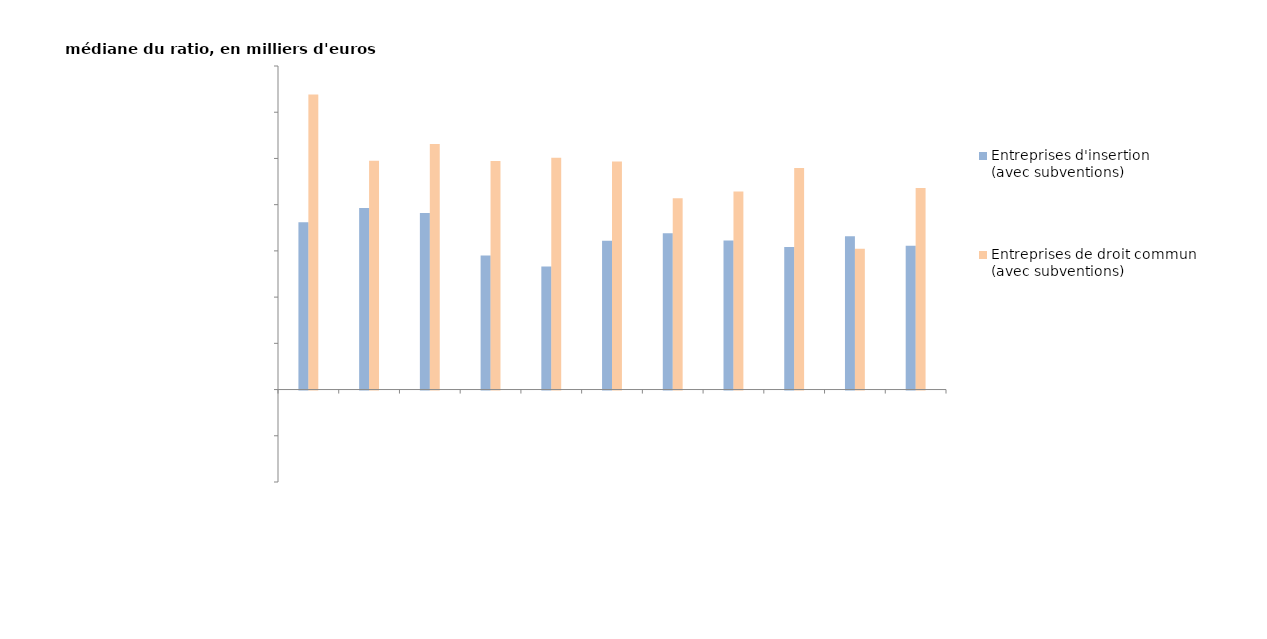
| Category | Entreprises d'insertion 
(avec subventions) | Entreprises de droit commun 
(avec subventions) |
|---|---|---|
| Déchets | 36.192 | 63.817 |
| Construction | 39.272 | 49.52 |
| Automobile et motocycle | 38.204 | 53.104 |
| Commerce de détail | 28.998 | 49.439 |
| Transports | 26.617 | 50.156 |
| Restauration | 32.215 | 49.365 |
| Bâtiment | 33.793 | 41.383 |
| Services administratifs | 32.24 | 42.853 |
| Action sociale | 30.818 | 47.914 |
| Réparation | 33.173 | 30.479 |
| Services personnels | 31.105 | 43.582 |